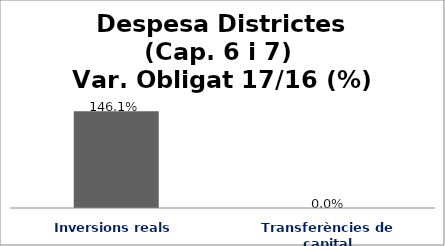
| Category | Series 0 |
|---|---|
| Inversions reals | 1.461 |
| Transferències de capital | 0 |